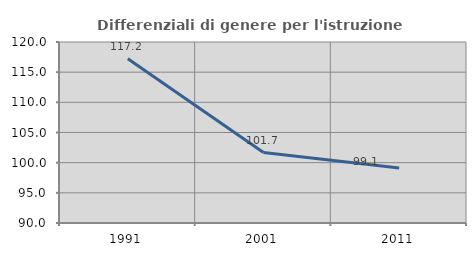
| Category | Differenziali di genere per l'istruzione superiore |
|---|---|
| 1991.0 | 117.239 |
| 2001.0 | 101.668 |
| 2011.0 | 99.111 |